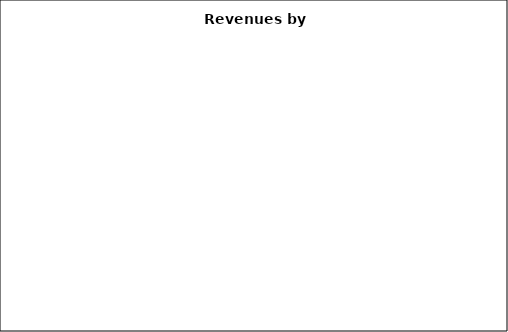
| Category | Series 0 |
|---|---|
| Charges for services | 0 |
| Unrestricted investment earnings | 0 |
| Property taxes | 0 |
| Gain or (loss) on disposal of capital assets | 0 |
| Unrestricted state aid | 0 |
| Capital grants and contributions | 0 |
| Operating grants and contributions | 0 |
| Unrestricted grants and contributions | 0 |